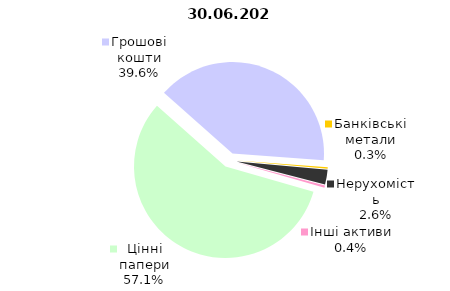
| Category | 30.06.2020 |
|---|---|
| Цінні папери | 1925.449 |
| Грошові кошти | 1336.633 |
| Банківські метали | 9.733 |
| Нерухомість | 88.274 |
| Інші активи | 12.94 |